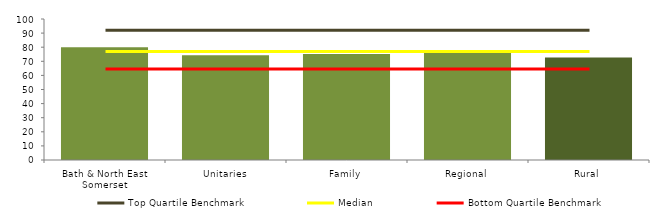
| Category | Block Data |
|---|---|
| Bath & North East Somerset | 80 |
| Unitaries | 74.236 |
| Family | 75.25 |
| Regional | 76.818 |
| Rural | 72.722 |